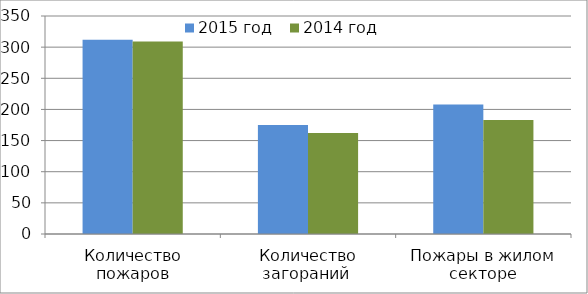
| Category | 2015 год | 2014 год |
|---|---|---|
| Количество пожаров | 312 | 309 |
| Количество загораний  | 175 | 162 |
| Пожары в жилом секторе | 208 | 183 |